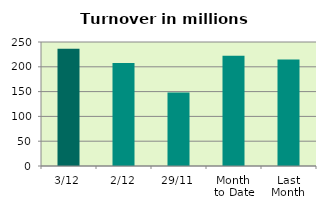
| Category | Series 0 |
|---|---|
| 3/12 | 236.567 |
| 2/12 | 207.55 |
| 29/11 | 148.405 |
| Month 
to Date | 222.059 |
| Last
Month | 214.794 |